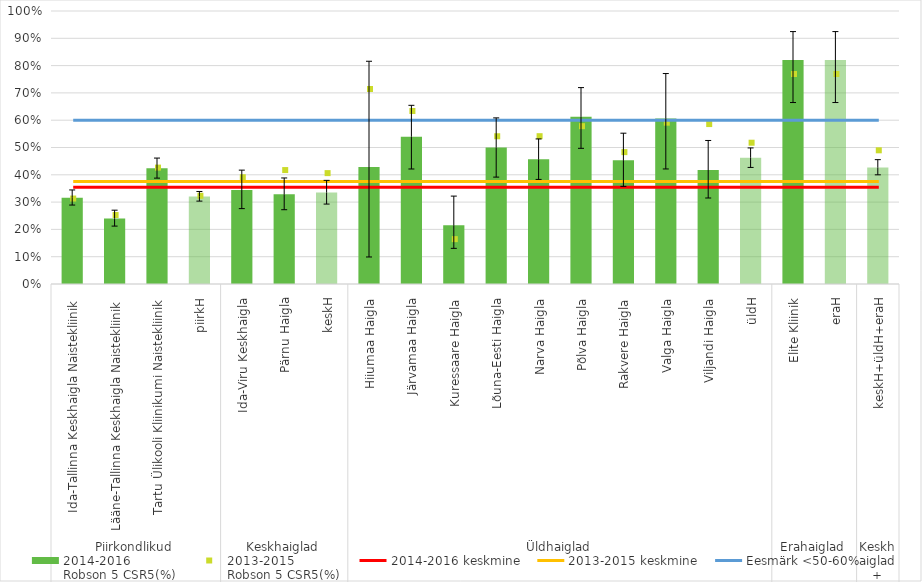
| Category | 2014-2016
Robson 5 CSR5(%) |
|---|---|
| 0 | 0.316 |
| 1 | 0.24 |
| 2 | 0.424 |
| 3 | 0.321 |
| 4 | 0.344 |
| 5 | 0.328 |
| 6 | 0.335 |
| 7 | 0.429 |
| 8 | 0.539 |
| 9 | 0.215 |
| 10 | 0.5 |
| 11 | 0.457 |
| 12 | 0.612 |
| 13 | 0.454 |
| 14 | 0.606 |
| 15 | 0.418 |
| 16 | 0.462 |
| 17 | 0.821 |
| 18 | 0.821 |
| 19 | 0.427 |